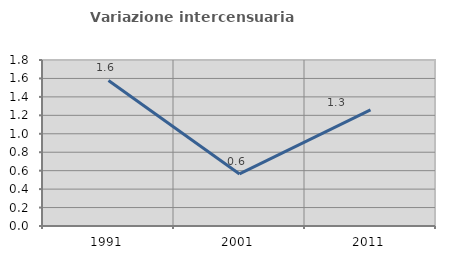
| Category | Variazione intercensuaria annua |
|---|---|
| 1991.0 | 1.578 |
| 2001.0 | 0.564 |
| 2011.0 | 1.259 |